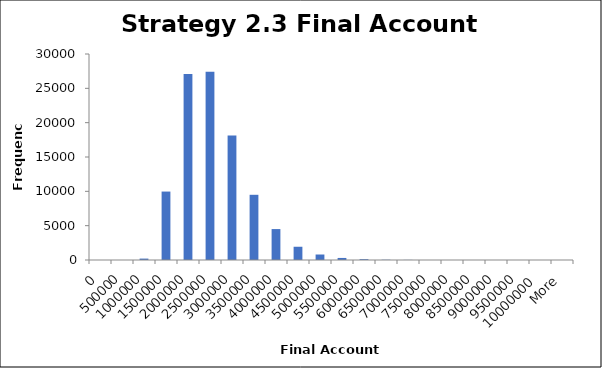
| Category | Frequency |
|---|---|
| 0 | 0 |
| 500000 | 0 |
| 1000000 | 205 |
| 1500000 | 9967 |
| 2000000 | 27088 |
| 2500000 | 27410 |
| 3000000 | 18126 |
| 3500000 | 9496 |
| 4000000 | 4504 |
| 4500000 | 1929 |
| 5000000 | 800 |
| 5500000 | 299 |
| 6000000 | 121 |
| 6500000 | 37 |
| 7000000 | 16 |
| 7500000 | 3 |
| 8000000 | 0 |
| 8500000 | 0 |
| 9000000 | 0 |
| 9500000 | 0 |
| 10000000 | 0 |
| More | 1 |